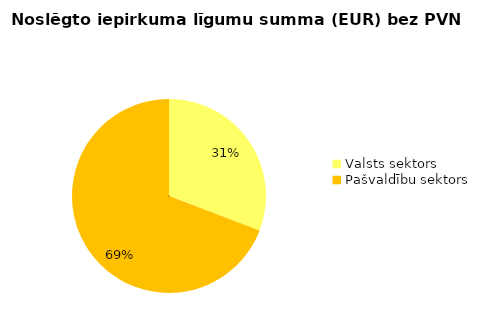
| Category | Noslēgto iepirkuma līgumu summa (EUR) bez PVN |
|---|---|
| Valsts sektors | 2751228 |
| Pašvaldību sektors | 6180498 |